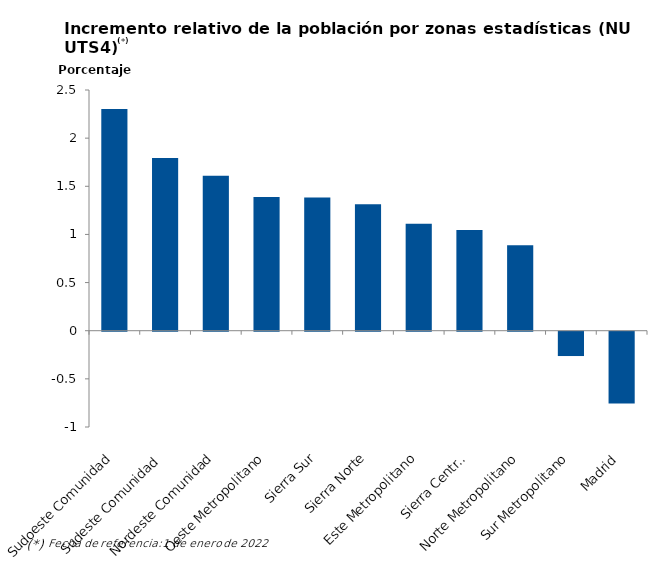
| Category | Series 0 |
|---|---|
| Sudoeste Comunidad | 2.302 |
| Sudeste Comunidad | 1.794 |
| Nordeste Comunidad | 1.608 |
| Oeste Metropolitano | 1.389 |
| Sierra Sur | 1.385 |
| Sierra Norte | 1.314 |
| Este Metropolitano | 1.11 |
| Sierra Central | 1.047 |
| Norte Metropolitano | 0.888 |
| Sur Metropolitano | -0.253 |
| Madrid | -0.745 |